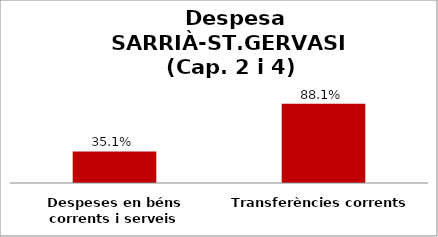
| Category | Series 0 |
|---|---|
| Despeses en béns corrents i serveis | 0.351 |
| Transferències corrents | 0.881 |